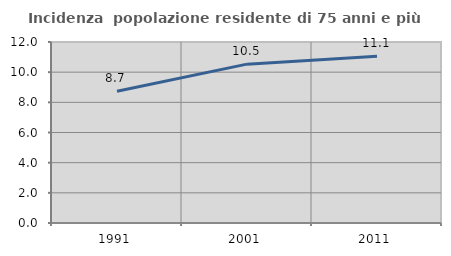
| Category | Incidenza  popolazione residente di 75 anni e più |
|---|---|
| 1991.0 | 8.74 |
| 2001.0 | 10.531 |
| 2011.0 | 11.054 |